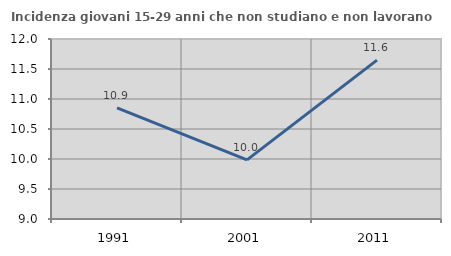
| Category | Incidenza giovani 15-29 anni che non studiano e non lavorano  |
|---|---|
| 1991.0 | 10.853 |
| 2001.0 | 9.986 |
| 2011.0 | 11.647 |